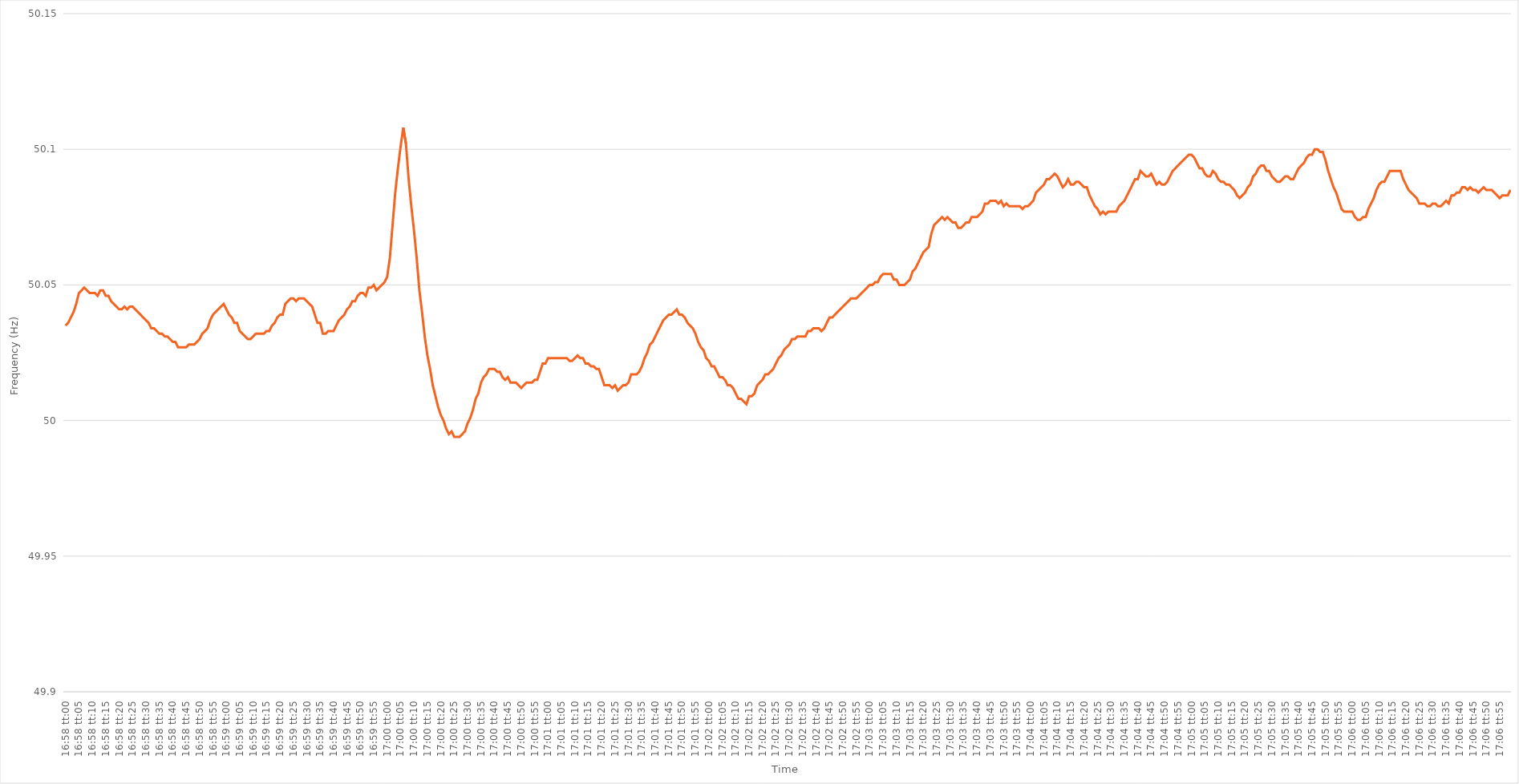
| Category | Series 0 |
|---|---|
| 0.7069444444444444 | 50.035 |
| 0.7069560185185185 | 50.036 |
| 0.7069675925925926 | 50.038 |
| 0.7069791666666667 | 50.04 |
| 0.7069907407407406 | 50.043 |
| 0.7070023148148148 | 50.047 |
| 0.7070138888888889 | 50.048 |
| 0.707025462962963 | 50.049 |
| 0.707037037037037 | 50.048 |
| 0.7070486111111111 | 50.047 |
| 0.7070601851851852 | 50.047 |
| 0.7070717592592594 | 50.047 |
| 0.7070833333333333 | 50.046 |
| 0.7070949074074074 | 50.048 |
| 0.7071064814814815 | 50.048 |
| 0.7071180555555556 | 50.046 |
| 0.7071296296296296 | 50.046 |
| 0.7071412037037037 | 50.044 |
| 0.7071527777777779 | 50.043 |
| 0.7071643518518519 | 50.042 |
| 0.7071759259259259 | 50.041 |
| 0.7071875 | 50.041 |
| 0.7071990740740741 | 50.042 |
| 0.707210648148148 | 50.041 |
| 0.7072222222222222 | 50.042 |
| 0.7072337962962963 | 50.042 |
| 0.7072453703703704 | 50.041 |
| 0.7072569444444444 | 50.04 |
| 0.7072685185185185 | 50.039 |
| 0.7072800925925926 | 50.038 |
| 0.7072916666666668 | 50.037 |
| 0.7073032407407407 | 50.036 |
| 0.7073148148148148 | 50.034 |
| 0.7073263888888889 | 50.034 |
| 0.707337962962963 | 50.033 |
| 0.707349537037037 | 50.032 |
| 0.7073611111111111 | 50.032 |
| 0.7073726851851853 | 50.031 |
| 0.7073842592592593 | 50.031 |
| 0.7073958333333333 | 50.03 |
| 0.7074074074074074 | 50.029 |
| 0.7074189814814815 | 50.029 |
| 0.7074305555555555 | 50.027 |
| 0.7074421296296296 | 50.027 |
| 0.7074537037037038 | 50.027 |
| 0.7074652777777778 | 50.027 |
| 0.7074768518518518 | 50.028 |
| 0.7074884259259259 | 50.028 |
| 0.7075 | 50.028 |
| 0.7075115740740742 | 50.029 |
| 0.7075231481481481 | 50.03 |
| 0.7075347222222222 | 50.032 |
| 0.7075462962962963 | 50.033 |
| 0.7075578703703704 | 50.034 |
| 0.7075694444444444 | 50.037 |
| 0.7075810185185185 | 50.039 |
| 0.7075925925925927 | 50.04 |
| 0.7076041666666667 | 50.041 |
| 0.7076157407407407 | 50.042 |
| 0.7076273148148148 | 50.043 |
| 0.7076388888888889 | 50.041 |
| 0.7076504629629629 | 50.039 |
| 0.707662037037037 | 50.038 |
| 0.7076736111111112 | 50.036 |
| 0.7076851851851852 | 50.036 |
| 0.7076967592592592 | 50.033 |
| 0.7077083333333333 | 50.032 |
| 0.7077199074074074 | 50.031 |
| 0.7077314814814816 | 50.03 |
| 0.7077430555555555 | 50.03 |
| 0.7077546296296297 | 50.031 |
| 0.7077662037037037 | 50.032 |
| 0.7077777777777778 | 50.032 |
| 0.7077893518518518 | 50.032 |
| 0.7078009259259259 | 50.032 |
| 0.7078125000000001 | 50.033 |
| 0.7078240740740741 | 50.033 |
| 0.7078356481481481 | 50.035 |
| 0.7078472222222222 | 50.036 |
| 0.7078587962962963 | 50.038 |
| 0.7078703703703703 | 50.039 |
| 0.7078819444444444 | 50.039 |
| 0.7078935185185186 | 50.043 |
| 0.7079050925925926 | 50.044 |
| 0.7079166666666666 | 50.045 |
| 0.7079282407407407 | 50.045 |
| 0.7079398148148148 | 50.044 |
| 0.707951388888889 | 50.045 |
| 0.7079629629629629 | 50.045 |
| 0.707974537037037 | 50.045 |
| 0.7079861111111111 | 50.044 |
| 0.7079976851851852 | 50.043 |
| 0.7080092592592592 | 50.042 |
| 0.7080208333333333 | 50.039 |
| 0.7080324074074075 | 50.036 |
| 0.7080439814814815 | 50.036 |
| 0.7080555555555555 | 50.032 |
| 0.7080671296296296 | 50.032 |
| 0.7080787037037037 | 50.033 |
| 0.7080902777777777 | 50.033 |
| 0.7081018518518518 | 50.033 |
| 0.708113425925926 | 50.035 |
| 0.708125 | 50.037 |
| 0.708136574074074 | 50.038 |
| 0.7081481481481481 | 50.039 |
| 0.7081597222222222 | 50.041 |
| 0.7081712962962964 | 50.042 |
| 0.7081828703703703 | 50.044 |
| 0.7081944444444445 | 50.044 |
| 0.7082060185185185 | 50.046 |
| 0.7082175925925926 | 50.047 |
| 0.7082291666666666 | 50.047 |
| 0.7082407407407407 | 50.046 |
| 0.7082523148148149 | 50.049 |
| 0.7082638888888889 | 50.049 |
| 0.708275462962963 | 50.05 |
| 0.708287037037037 | 50.048 |
| 0.7082986111111111 | 50.049 |
| 0.7083101851851853 | 50.05 |
| 0.7083217592592592 | 50.051 |
| 0.7083333333333334 | 50.053 |
| 0.7083449074074074 | 50.06 |
| 0.7083564814814814 | 50.072 |
| 0.7083680555555555 | 50.084 |
| 0.7083796296296296 | 50.093 |
| 0.7083912037037038 | 50.101 |
| 0.7084027777777777 | 50.108 |
| 0.7084143518518519 | 50.102 |
| 0.7084259259259259 | 50.089 |
| 0.7084375 | 50.079 |
| 0.708449074074074 | 50.07 |
| 0.7084606481481481 | 50.06 |
| 0.7084722222222223 | 50.048 |
| 0.7084837962962963 | 50.04 |
| 0.7084953703703704 | 50.031 |
| 0.7085069444444444 | 50.024 |
| 0.7085185185185185 | 50.019 |
| 0.7085300925925927 | 50.013 |
| 0.7085416666666666 | 50.009 |
| 0.7085532407407408 | 50.005 |
| 0.7085648148148148 | 50.002 |
| 0.7085763888888889 | 50 |
| 0.7085879629629629 | 49.997 |
| 0.708599537037037 | 49.995 |
| 0.7086111111111112 | 49.996 |
| 0.7086226851851851 | 49.994 |
| 0.7086342592592593 | 49.994 |
| 0.7086458333333333 | 49.994 |
| 0.7086574074074075 | 49.995 |
| 0.7086689814814814 | 49.996 |
| 0.7086805555555555 | 49.999 |
| 0.7086921296296297 | 50.001 |
| 0.7087037037037037 | 50.004 |
| 0.7087152777777778 | 50.008 |
| 0.7087268518518518 | 50.01 |
| 0.708738425925926 | 50.014 |
| 0.7087500000000001 | 50.016 |
| 0.708761574074074 | 50.017 |
| 0.7087731481481482 | 50.019 |
| 0.7087847222222222 | 50.019 |
| 0.7087962962962964 | 50.019 |
| 0.7088078703703703 | 50.018 |
| 0.7088194444444444 | 50.018 |
| 0.7088310185185186 | 50.016 |
| 0.7088425925925925 | 50.015 |
| 0.7088541666666667 | 50.016 |
| 0.7088657407407407 | 50.014 |
| 0.7088773148148149 | 50.014 |
| 0.7088888888888888 | 50.014 |
| 0.7089004629629629 | 50.013 |
| 0.7089120370370371 | 50.012 |
| 0.7089236111111111 | 50.013 |
| 0.7089351851851852 | 50.014 |
| 0.7089467592592592 | 50.014 |
| 0.7089583333333334 | 50.014 |
| 0.7089699074074075 | 50.015 |
| 0.7089814814814814 | 50.015 |
| 0.7089930555555556 | 50.018 |
| 0.7090046296296296 | 50.021 |
| 0.7090162037037038 | 50.021 |
| 0.7090277777777777 | 50.023 |
| 0.7090393518518519 | 50.023 |
| 0.709050925925926 | 50.023 |
| 0.7090624999999999 | 50.023 |
| 0.7090740740740741 | 50.023 |
| 0.7090856481481481 | 50.023 |
| 0.7090972222222223 | 50.023 |
| 0.7091087962962962 | 50.023 |
| 0.7091203703703703 | 50.022 |
| 0.7091319444444445 | 50.022 |
| 0.7091435185185185 | 50.023 |
| 0.7091550925925926 | 50.024 |
| 0.7091666666666666 | 50.023 |
| 0.7091782407407408 | 50.023 |
| 0.7091898148148149 | 50.021 |
| 0.7092013888888888 | 50.021 |
| 0.709212962962963 | 50.02 |
| 0.709224537037037 | 50.02 |
| 0.7092361111111112 | 50.019 |
| 0.7092476851851851 | 50.019 |
| 0.7092592592592593 | 50.016 |
| 0.7092708333333334 | 50.013 |
| 0.7092824074074073 | 50.013 |
| 0.7092939814814815 | 50.013 |
| 0.7093055555555555 | 50.012 |
| 0.7093171296296297 | 50.013 |
| 0.7093287037037036 | 50.011 |
| 0.7093402777777778 | 50.012 |
| 0.7093518518518519 | 50.013 |
| 0.7093634259259259 | 50.013 |
| 0.709375 | 50.014 |
| 0.709386574074074 | 50.017 |
| 0.7093981481481482 | 50.017 |
| 0.7094097222222223 | 50.017 |
| 0.7094212962962962 | 50.018 |
| 0.7094328703703704 | 50.02 |
| 0.7094444444444444 | 50.023 |
| 0.7094560185185186 | 50.025 |
| 0.7094675925925925 | 50.028 |
| 0.7094791666666667 | 50.029 |
| 0.7094907407407408 | 50.031 |
| 0.7095023148148148 | 50.033 |
| 0.7095138888888889 | 50.035 |
| 0.7095254629629629 | 50.037 |
| 0.7095370370370371 | 50.038 |
| 0.709548611111111 | 50.039 |
| 0.7095601851851852 | 50.039 |
| 0.7095717592592593 | 50.04 |
| 0.7095833333333333 | 50.041 |
| 0.7095949074074074 | 50.039 |
| 0.7096064814814814 | 50.039 |
| 0.7096180555555556 | 50.038 |
| 0.7096296296296297 | 50.036 |
| 0.7096412037037036 | 50.035 |
| 0.7096527777777778 | 50.034 |
| 0.7096643518518518 | 50.032 |
| 0.709675925925926 | 50.029 |
| 0.7096874999999999 | 50.027 |
| 0.7096990740740741 | 50.026 |
| 0.7097106481481482 | 50.023 |
| 0.7097222222222223 | 50.022 |
| 0.7097337962962963 | 50.02 |
| 0.7097453703703703 | 50.02 |
| 0.7097569444444445 | 50.018 |
| 0.7097685185185184 | 50.016 |
| 0.7097800925925926 | 50.016 |
| 0.7097916666666667 | 50.015 |
| 0.7098032407407407 | 50.013 |
| 0.7098148148148148 | 50.013 |
| 0.7098263888888888 | 50.012 |
| 0.709837962962963 | 50.01 |
| 0.7098495370370371 | 50.008 |
| 0.709861111111111 | 50.008 |
| 0.7098726851851852 | 50.007 |
| 0.7098842592592592 | 50.006 |
| 0.7098958333333334 | 50.009 |
| 0.7099074074074073 | 50.009 |
| 0.7099189814814815 | 50.01 |
| 0.7099305555555556 | 50.013 |
| 0.7099421296296297 | 50.014 |
| 0.7099537037037037 | 50.015 |
| 0.7099652777777777 | 50.017 |
| 0.7099768518518519 | 50.017 |
| 0.709988425925926 | 50.018 |
| 0.71 | 50.019 |
| 0.7100115740740741 | 50.021 |
| 0.7100231481481482 | 50.023 |
| 0.7100347222222222 | 50.024 |
| 0.7100462962962962 | 50.026 |
| 0.7100578703703704 | 50.027 |
| 0.7100694444444445 | 50.028 |
| 0.7100810185185185 | 50.03 |
| 0.7100925925925926 | 50.03 |
| 0.7101041666666666 | 50.031 |
| 0.7101157407407408 | 50.031 |
| 0.7101273148148147 | 50.031 |
| 0.7101388888888889 | 50.031 |
| 0.710150462962963 | 50.033 |
| 0.7101620370370371 | 50.033 |
| 0.7101736111111111 | 50.034 |
| 0.7101851851851851 | 50.034 |
| 0.7101967592592593 | 50.034 |
| 0.7102083333333334 | 50.033 |
| 0.7102199074074074 | 50.034 |
| 0.7102314814814815 | 50.036 |
| 0.7102430555555556 | 50.038 |
| 0.7102546296296296 | 50.038 |
| 0.7102662037037036 | 50.039 |
| 0.7102777777777778 | 50.04 |
| 0.7102893518518519 | 50.041 |
| 0.7103009259259259 | 50.042 |
| 0.7103125 | 50.043 |
| 0.710324074074074 | 50.044 |
| 0.7103356481481482 | 50.045 |
| 0.7103472222222221 | 50.045 |
| 0.7103587962962963 | 50.045 |
| 0.7103703703703704 | 50.046 |
| 0.7103819444444445 | 50.047 |
| 0.7103935185185185 | 50.048 |
| 0.7104050925925925 | 50.049 |
| 0.7104166666666667 | 50.05 |
| 0.7104282407407408 | 50.05 |
| 0.7104398148148148 | 50.051 |
| 0.7104513888888889 | 50.051 |
| 0.710462962962963 | 50.053 |
| 0.710474537037037 | 50.054 |
| 0.710486111111111 | 50.054 |
| 0.7104976851851852 | 50.054 |
| 0.7105092592592593 | 50.054 |
| 0.7105208333333333 | 50.052 |
| 0.7105324074074074 | 50.052 |
| 0.7105439814814815 | 50.05 |
| 0.7105555555555556 | 50.05 |
| 0.7105671296296295 | 50.05 |
| 0.7105787037037037 | 50.051 |
| 0.7105902777777778 | 50.052 |
| 0.7106018518518519 | 50.055 |
| 0.7106134259259259 | 50.056 |
| 0.710625 | 50.058 |
| 0.7106365740740741 | 50.06 |
| 0.7106481481481483 | 50.062 |
| 0.7106597222222222 | 50.063 |
| 0.7106712962962963 | 50.064 |
| 0.7106828703703704 | 50.069 |
| 0.7106944444444445 | 50.072 |
| 0.7107060185185184 | 50.073 |
| 0.7107175925925926 | 50.074 |
| 0.7107291666666667 | 50.075 |
| 0.7107407407407407 | 50.074 |
| 0.7107523148148148 | 50.075 |
| 0.7107638888888889 | 50.074 |
| 0.710775462962963 | 50.073 |
| 0.7107870370370369 | 50.073 |
| 0.7107986111111111 | 50.071 |
| 0.7108101851851852 | 50.071 |
| 0.7108217592592593 | 50.072 |
| 0.7108333333333333 | 50.073 |
| 0.7108449074074074 | 50.073 |
| 0.7108564814814815 | 50.075 |
| 0.7108680555555557 | 50.075 |
| 0.7108796296296296 | 50.075 |
| 0.7108912037037037 | 50.076 |
| 0.7109027777777778 | 50.077 |
| 0.7109143518518519 | 50.08 |
| 0.7109259259259259 | 50.08 |
| 0.7109375 | 50.081 |
| 0.7109490740740741 | 50.081 |
| 0.7109606481481481 | 50.081 |
| 0.7109722222222222 | 50.08 |
| 0.7109837962962963 | 50.081 |
| 0.7109953703703704 | 50.079 |
| 0.7110069444444443 | 50.08 |
| 0.7110185185185185 | 50.079 |
| 0.7110300925925926 | 50.079 |
| 0.7110416666666667 | 50.079 |
| 0.7110532407407407 | 50.079 |
| 0.7110648148148148 | 50.079 |
| 0.7110763888888889 | 50.078 |
| 0.7110879629629631 | 50.079 |
| 0.711099537037037 | 50.079 |
| 0.7111111111111111 | 50.08 |
| 0.7111226851851852 | 50.081 |
| 0.7111342592592593 | 50.084 |
| 0.7111458333333333 | 50.085 |
| 0.7111574074074074 | 50.086 |
| 0.7111689814814816 | 50.087 |
| 0.7111805555555555 | 50.089 |
| 0.7111921296296296 | 50.089 |
| 0.7112037037037037 | 50.09 |
| 0.7112152777777778 | 50.091 |
| 0.7112268518518517 | 50.09 |
| 0.7112384259259259 | 50.088 |
| 0.71125 | 50.086 |
| 0.7112615740740741 | 50.087 |
| 0.7112731481481481 | 50.089 |
| 0.7112847222222222 | 50.087 |
| 0.7112962962962963 | 50.087 |
| 0.7113078703703705 | 50.088 |
| 0.7113194444444444 | 50.088 |
| 0.7113310185185185 | 50.087 |
| 0.7113425925925926 | 50.086 |
| 0.7113541666666667 | 50.086 |
| 0.7113657407407407 | 50.083 |
| 0.7113773148148148 | 50.081 |
| 0.711388888888889 | 50.079 |
| 0.711400462962963 | 50.078 |
| 0.711412037037037 | 50.076 |
| 0.7114236111111111 | 50.077 |
| 0.7114351851851852 | 50.076 |
| 0.7114467592592592 | 50.077 |
| 0.7114583333333333 | 50.077 |
| 0.7114699074074075 | 50.077 |
| 0.7114814814814815 | 50.077 |
| 0.7114930555555555 | 50.079 |
| 0.7115046296296296 | 50.08 |
| 0.7115162037037037 | 50.081 |
| 0.7115277777777779 | 50.083 |
| 0.7115393518518518 | 50.085 |
| 0.711550925925926 | 50.087 |
| 0.7115625 | 50.089 |
| 0.7115740740740741 | 50.089 |
| 0.7115856481481481 | 50.092 |
| 0.7115972222222222 | 50.091 |
| 0.7116087962962964 | 50.09 |
| 0.7116203703703704 | 50.09 |
| 0.7116319444444444 | 50.091 |
| 0.7116435185185185 | 50.089 |
| 0.7116550925925926 | 50.087 |
| 0.7116666666666666 | 50.088 |
| 0.7116782407407407 | 50.087 |
| 0.7116898148148149 | 50.087 |
| 0.7117013888888889 | 50.088 |
| 0.7117129629629629 | 50.09 |
| 0.711724537037037 | 50.092 |
| 0.7117361111111111 | 50.093 |
| 0.7117476851851853 | 50.094 |
| 0.7117592592592592 | 50.095 |
| 0.7117708333333334 | 50.096 |
| 0.7117824074074074 | 50.097 |
| 0.7117939814814815 | 50.098 |
| 0.7118055555555555 | 50.098 |
| 0.7118171296296296 | 50.097 |
| 0.7118287037037038 | 50.095 |
| 0.7118402777777778 | 50.093 |
| 0.7118518518518518 | 50.093 |
| 0.7118634259259259 | 50.091 |
| 0.711875 | 50.09 |
| 0.711886574074074 | 50.09 |
| 0.7118981481481481 | 50.092 |
| 0.7119097222222223 | 50.091 |
| 0.7119212962962963 | 50.089 |
| 0.7119328703703703 | 50.088 |
| 0.7119444444444444 | 50.088 |
| 0.7119560185185185 | 50.087 |
| 0.7119675925925927 | 50.087 |
| 0.7119791666666666 | 50.086 |
| 0.7119907407407408 | 50.085 |
| 0.7120023148148148 | 50.083 |
| 0.712013888888889 | 50.082 |
| 0.7120254629629629 | 50.083 |
| 0.712037037037037 | 50.084 |
| 0.7120486111111112 | 50.086 |
| 0.7120601851851852 | 50.087 |
| 0.7120717592592593 | 50.09 |
| 0.7120833333333333 | 50.091 |
| 0.7120949074074074 | 50.093 |
| 0.7121064814814816 | 50.094 |
| 0.7121180555555555 | 50.094 |
| 0.7121296296296297 | 50.092 |
| 0.7121412037037037 | 50.092 |
| 0.7121527777777777 | 50.09 |
| 0.7121643518518518 | 50.089 |
| 0.7121759259259259 | 50.088 |
| 0.7121875000000001 | 50.088 |
| 0.712199074074074 | 50.089 |
| 0.7122106481481482 | 50.09 |
| 0.7122222222222222 | 50.09 |
| 0.7122337962962964 | 50.089 |
| 0.7122453703703703 | 50.089 |
| 0.7122569444444444 | 50.091 |
| 0.7122685185185186 | 50.093 |
| 0.7122800925925926 | 50.094 |
| 0.7122916666666667 | 50.095 |
| 0.7123032407407407 | 50.097 |
| 0.7123148148148148 | 50.098 |
| 0.712326388888889 | 50.098 |
| 0.7123379629629629 | 50.1 |
| 0.7123495370370371 | 50.1 |
| 0.7123611111111111 | 50.099 |
| 0.7123726851851852 | 50.099 |
| 0.7123842592592592 | 50.096 |
| 0.7123958333333333 | 50.092 |
| 0.7124074074074075 | 50.089 |
| 0.7124189814814814 | 50.086 |
| 0.7124305555555556 | 50.084 |
| 0.7124421296296296 | 50.081 |
| 0.7124537037037038 | 50.078 |
| 0.7124652777777777 | 50.077 |
| 0.7124768518518518 | 50.077 |
| 0.712488425925926 | 50.077 |
| 0.7125 | 50.077 |
| 0.7125115740740741 | 50.075 |
| 0.7125231481481481 | 50.074 |
| 0.7125347222222222 | 50.074 |
| 0.7125462962962964 | 50.075 |
| 0.7125578703703703 | 50.075 |
| 0.7125694444444445 | 50.078 |
| 0.7125810185185185 | 50.08 |
| 0.7125925925925927 | 50.082 |
| 0.7126041666666666 | 50.085 |
| 0.7126157407407407 | 50.087 |
| 0.7126273148148149 | 50.088 |
| 0.7126388888888888 | 50.088 |
| 0.712650462962963 | 50.09 |
| 0.712662037037037 | 50.092 |
| 0.7126736111111112 | 50.092 |
| 0.7126851851851851 | 50.092 |
| 0.7126967592592592 | 50.092 |
| 0.7127083333333334 | 50.092 |
| 0.7127199074074074 | 50.089 |
| 0.7127314814814815 | 50.087 |
| 0.7127430555555555 | 50.085 |
| 0.7127546296296297 | 50.084 |
| 0.7127662037037038 | 50.083 |
| 0.7127777777777777 | 50.082 |
| 0.7127893518518519 | 50.08 |
| 0.7128009259259259 | 50.08 |
| 0.7128125000000001 | 50.08 |
| 0.712824074074074 | 50.079 |
| 0.7128356481481481 | 50.079 |
| 0.7128472222222223 | 50.08 |
| 0.7128587962962962 | 50.08 |
| 0.7128703703703704 | 50.079 |
| 0.7128819444444444 | 50.079 |
| 0.7128935185185186 | 50.08 |
| 0.7129050925925925 | 50.081 |
| 0.7129166666666666 | 50.08 |
| 0.7129282407407408 | 50.083 |
| 0.7129398148148148 | 50.083 |
| 0.7129513888888889 | 50.084 |
| 0.7129629629629629 | 50.084 |
| 0.7129745370370371 | 50.086 |
| 0.7129861111111112 | 50.086 |
| 0.7129976851851851 | 50.085 |
| 0.7130092592592593 | 50.086 |
| 0.7130208333333333 | 50.085 |
| 0.7130324074074075 | 50.085 |
| 0.7130439814814814 | 50.084 |
| 0.7130555555555556 | 50.085 |
| 0.7130671296296297 | 50.086 |
| 0.7130787037037036 | 50.085 |
| 0.7130902777777778 | 50.085 |
| 0.7131018518518518 | 50.085 |
| 0.713113425925926 | 50.084 |
| 0.7131249999999999 | 50.083 |
| 0.713136574074074 | 50.082 |
| 0.7131481481481482 | 50.083 |
| 0.7131597222222222 | 50.083 |
| 0.7131712962962963 | 50.083 |
| 0.7131828703703703 | 50.085 |